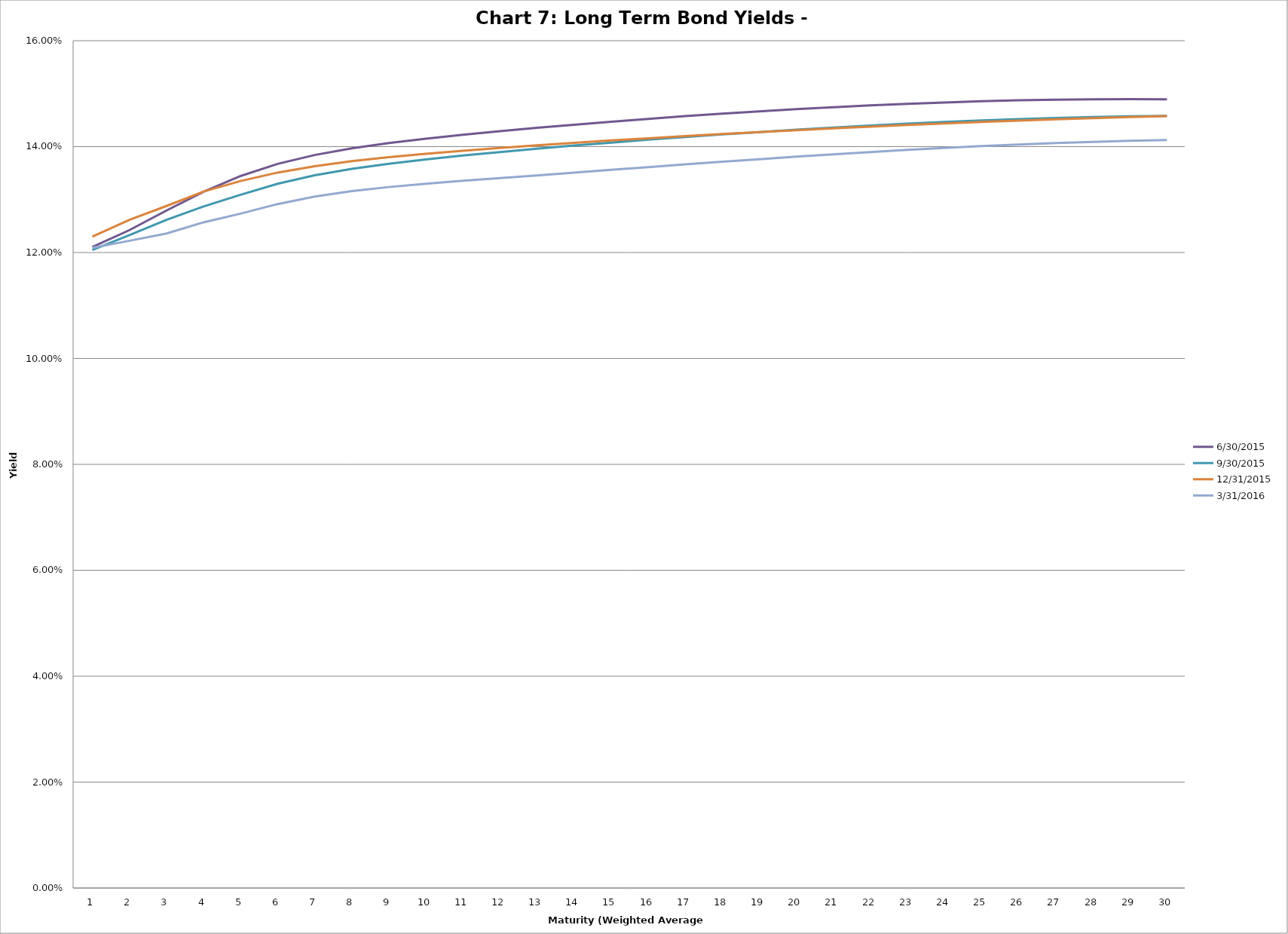
| Category | 6/30/2015 | 9/30/2015 | 12/31/2015 | 3/31/2016 |
|---|---|---|---|---|
| 0 | 0.121 | 0.12 | 0.123 | 0.121 |
| 1 | 0.124 | 0.123 | 0.126 | 0.122 |
| 2 | 0.128 | 0.126 | 0.129 | 0.124 |
| 3 | 0.131 | 0.129 | 0.132 | 0.126 |
| 4 | 0.134 | 0.131 | 0.134 | 0.127 |
| 5 | 0.137 | 0.133 | 0.135 | 0.129 |
| 6 | 0.138 | 0.135 | 0.136 | 0.131 |
| 7 | 0.14 | 0.136 | 0.137 | 0.132 |
| 8 | 0.141 | 0.137 | 0.138 | 0.132 |
| 9 | 0.141 | 0.138 | 0.139 | 0.133 |
| 10 | 0.142 | 0.138 | 0.139 | 0.134 |
| 11 | 0.143 | 0.139 | 0.14 | 0.134 |
| 12 | 0.144 | 0.14 | 0.14 | 0.135 |
| 13 | 0.144 | 0.14 | 0.141 | 0.135 |
| 14 | 0.145 | 0.141 | 0.141 | 0.136 |
| 15 | 0.145 | 0.141 | 0.142 | 0.136 |
| 16 | 0.146 | 0.142 | 0.142 | 0.137 |
| 17 | 0.146 | 0.142 | 0.142 | 0.137 |
| 18 | 0.147 | 0.143 | 0.143 | 0.138 |
| 19 | 0.147 | 0.143 | 0.143 | 0.138 |
| 20 | 0.147 | 0.144 | 0.143 | 0.139 |
| 21 | 0.148 | 0.144 | 0.144 | 0.139 |
| 22 | 0.148 | 0.144 | 0.144 | 0.139 |
| 23 | 0.148 | 0.145 | 0.144 | 0.14 |
| 24 | 0.149 | 0.145 | 0.145 | 0.14 |
| 25 | 0.149 | 0.145 | 0.145 | 0.14 |
| 26 | 0.149 | 0.145 | 0.145 | 0.141 |
| 27 | 0.149 | 0.146 | 0.145 | 0.141 |
| 28 | 0.149 | 0.146 | 0.146 | 0.141 |
| 29 | 0.149 | 0.146 | 0.146 | 0.141 |